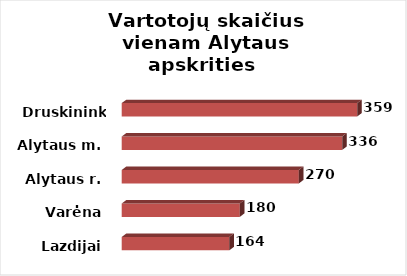
| Category | Series 0 |
|---|---|
| Lazdijai | 164 |
| Varėna | 180 |
| Alytaus r. | 270 |
| Alytaus m. | 336 |
| Druskininkai | 359 |